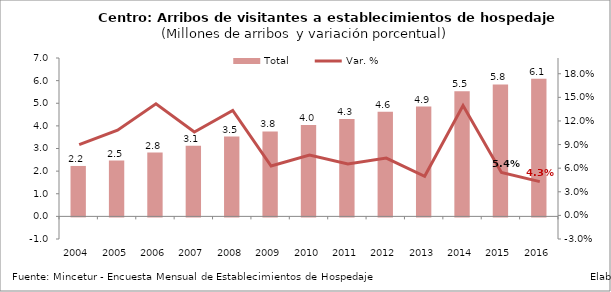
| Category | Total |
|---|---|
| 2004 | 2.228 |
| 2005 | 2.469 |
| 2006 | 2.82 |
| 2007 | 3.118 |
| 2008 | 3.534 |
| 2009 | 3.756 |
| 2010 | 4.044 |
| 2011 | 4.309 |
| 2012 | 4.622 |
| 2013 | 4.852 |
| 2014 | 5.529 |
| 2015 | 5.83 |
| 2016 | 6.081 |